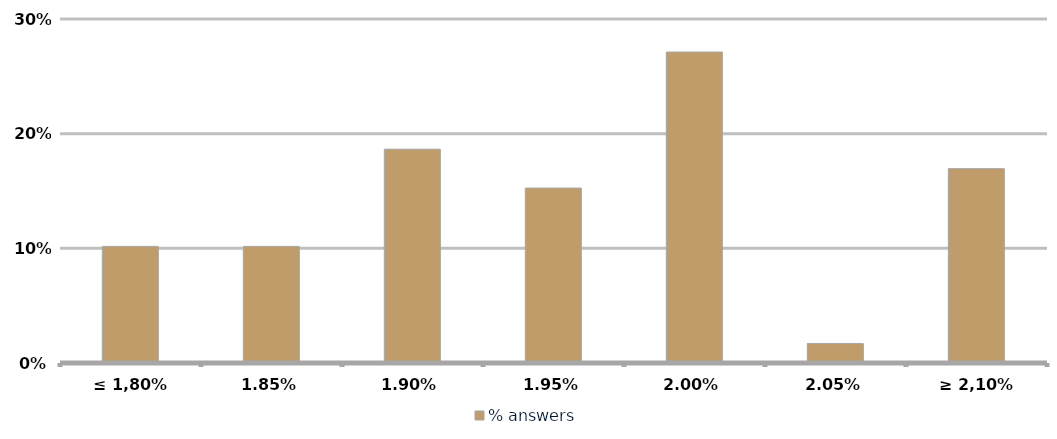
| Category | % answers |
|---|---|
| ≤ 1,80% | 0.102 |
| 1.85% | 0.102 |
| 1.90% | 0.186 |
| 1.95% | 0.153 |
| 2.00% | 0.271 |
| 2.05% | 0.017 |
| ≥ 2,10% | 0.169 |